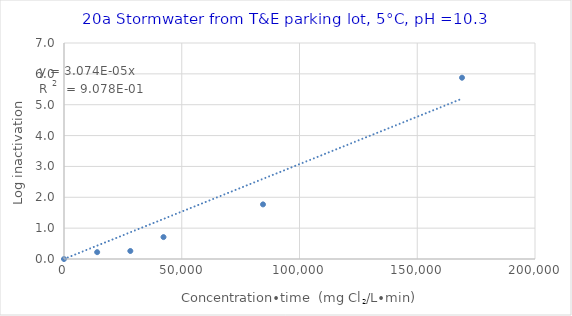
| Category | Series 0 |
|---|---|
| 0.0 | 0 |
| 14084.009883515708 | 0.222 |
| 28168.019767031416 | 0.26 |
| 42252.02965054712 | 0.71 |
| 84504.05930109424 | 1.77 |
| 169008.11860218848 | 5.875 |